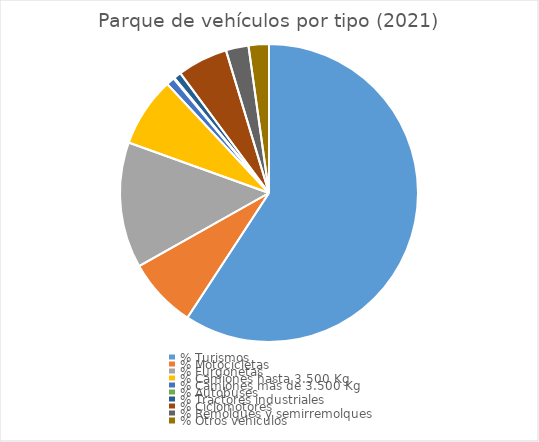
| Category | Series 0 |
|---|---|
| % Turismos | 0.592 |
| % Motocicletas | 0.076 |
| % Furgonetas | 0.136 |
| % Camiones hasta 3.500 Kg | 0.076 |
| % Camiones más de 3.500 Kg | 0.009 |
| % Autobuses | 0.001 |
| % Tractores industriales | 0.008 |
| % Ciclomotores | 0.055 |
| % Remolques y semirremolques | 0.025 |
| % Otros vehículos | 0.022 |